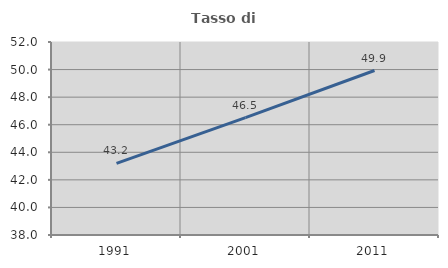
| Category | Tasso di occupazione   |
|---|---|
| 1991.0 | 43.197 |
| 2001.0 | 46.515 |
| 2011.0 | 49.931 |